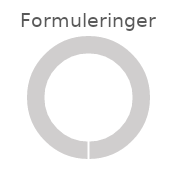
| Category | Formuleringer |
|---|---|
| 0 | 0 |
| 1 | 6 |